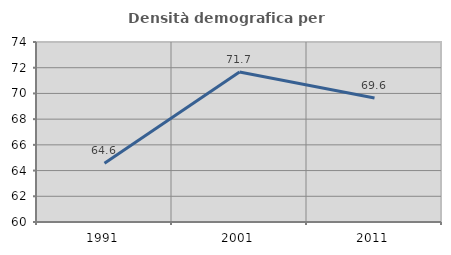
| Category | Densità demografica |
|---|---|
| 1991.0 | 64.564 |
| 2001.0 | 71.673 |
| 2011.0 | 69.642 |